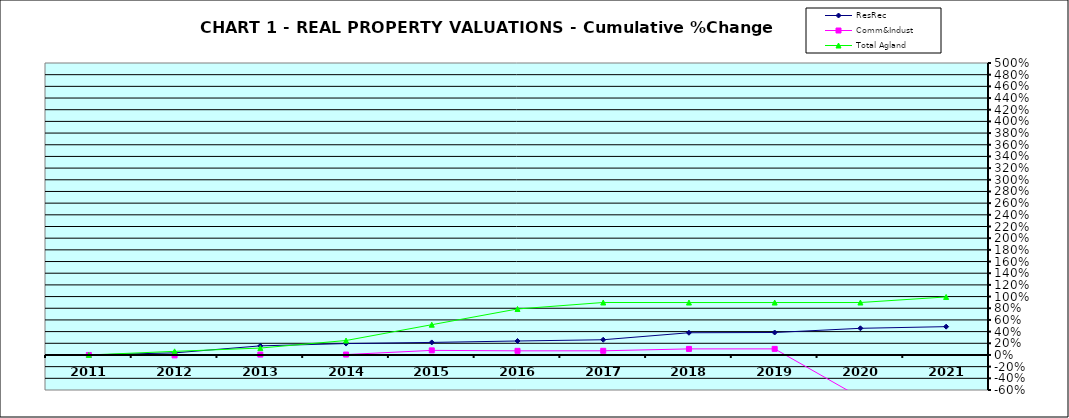
| Category | ResRec | Comm&Indust | Total Agland |
|---|---|---|---|
| 2011.0 | 0 | 0 | 0 |
| 2012.0 | 0.036 | -0.007 | 0.062 |
| 2013.0 | 0.156 | 0.007 | 0.118 |
| 2014.0 | 0.195 | 0.007 | 0.248 |
| 2015.0 | 0.215 | 0.079 | 0.518 |
| 2016.0 | 0.239 | 0.071 | 0.788 |
| 2017.0 | 0.261 | 0.071 | 0.898 |
| 2018.0 | 0.381 | 0.104 | 0.898 |
| 2019.0 | 0.384 | 0.104 | 0.898 |
| 2020.0 | 0.457 | -0.73 | 0.898 |
| 2021.0 | 0.485 | -0.729 | 0.994 |